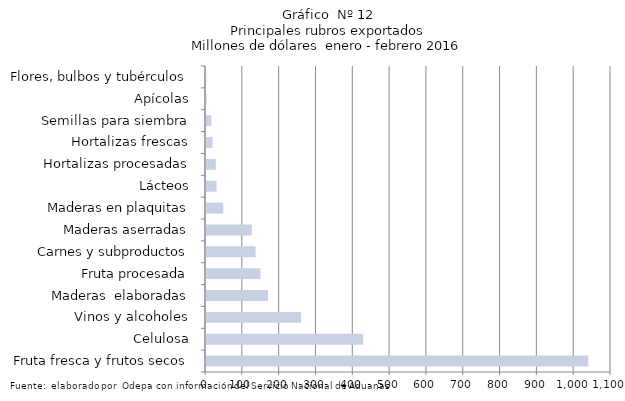
| Category | Series 7 |
|---|---|
| Fruta fresca y frutos secos | 1038313.811 |
| Celulosa | 426834.059 |
| Vinos y alcoholes | 257967.757 |
| Maderas  elaboradas | 168342.62 |
| Fruta procesada | 147628.606 |
| Carnes y subproductos | 134582.554 |
| Maderas aserradas | 124215.386 |
| Maderas en plaquitas | 46825.577 |
| Lácteos | 28651.109 |
| Hortalizas procesadas | 26471.442 |
| Hortalizas frescas | 17826.002 |
| Semillas para siembra | 14763.947 |
| Apícolas | 1689.622 |
| Flores, bulbos y tubérculos | 1061.9 |